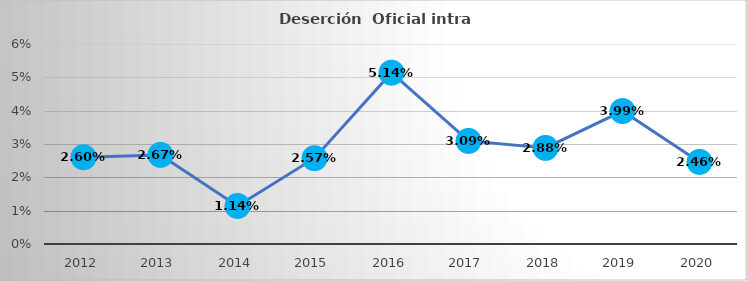
| Category | Series 0 |
|---|---|
| 2012.0 | 0.026 |
| 2013.0 | 0.027 |
| 2014.0 | 0.011 |
| 2015.0 | 0.026 |
| 2016.0 | 0.051 |
| 2017.0 | 0.031 |
| 2018.0 | 0.029 |
| 2019.0 | 0.04 |
| 2020.0 | 0.025 |